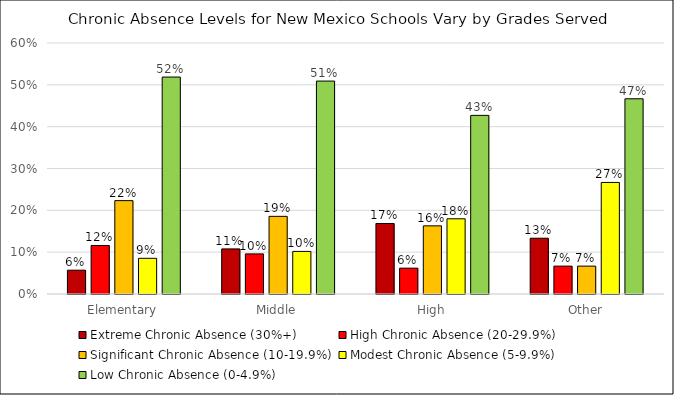
| Category | Extreme Chronic Absence (30%+) | High Chronic Absence (20-29.9%) | Significant Chronic Absence (10-19.9%) | Modest Chronic Absence (5-9.9%) | Low Chronic Absence (0-4.9%) |
|---|---|---|---|---|---|
| Elementary | 0.057 | 0.116 | 0.223 | 0.085 | 0.519 |
| Middle | 0.108 | 0.096 | 0.186 | 0.102 | 0.509 |
| High | 0.169 | 0.062 | 0.163 | 0.18 | 0.427 |
| Other | 0.133 | 0.067 | 0.067 | 0.267 | 0.467 |